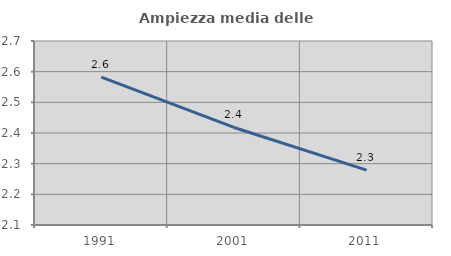
| Category | Ampiezza media delle famiglie |
|---|---|
| 1991.0 | 2.582 |
| 2001.0 | 2.418 |
| 2011.0 | 2.279 |